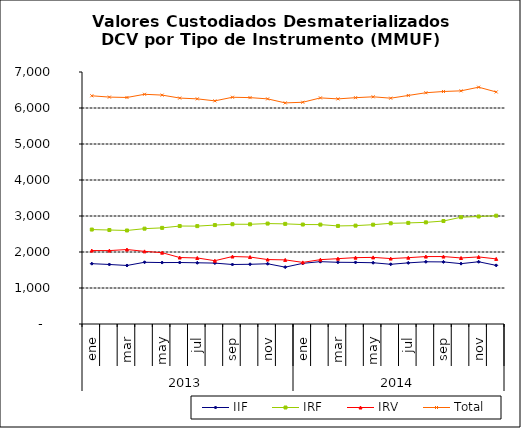
| Category | IIF | IRF | IRV | Total |
|---|---|---|---|---|
| 0 | 1675.661 | 2623.433 | 2040.209 | 6339.304 |
| 1900-01-01 | 1653.38 | 2610.269 | 2039.052 | 6302.701 |
| 1900-01-02 | 1625.654 | 2597.812 | 2068.804 | 6292.27 |
| 1900-01-03 | 1714.816 | 2648.442 | 2017.792 | 6381.05 |
| 1900-01-04 | 1706.556 | 2670.19 | 1981.652 | 6358.399 |
| 1900-01-05 | 1708.057 | 2721.259 | 1846.579 | 6275.895 |
| 1900-01-06 | 1700.223 | 2719.153 | 1834.309 | 6253.685 |
| 1900-01-07 | 1691.581 | 2748.09 | 1758.669 | 6198.341 |
| 1900-01-08 | 1652.698 | 2771.402 | 1874.421 | 6298.52 |
| 1900-01-09 | 1658.715 | 2769.674 | 1859.962 | 6288.351 |
| 1900-01-10 | 1673.399 | 2789.673 | 1790.218 | 6253.29 |
| 1900-01-11 | 1579.011 | 2781.284 | 1781.214 | 6141.51 |
| 1900-01-12 | 1685.081 | 2762.731 | 1711.633 | 6159.445 |
| 1900-01-13 | 1732.193 | 2760.863 | 1787.756 | 6280.813 |
| 1900-01-14 | 1714.333 | 2724.253 | 1814.882 | 6253.467 |
| 1900-01-15 | 1710.591 | 2732.637 | 1843.591 | 6286.819 |
| 1900-01-16 | 1701.759 | 2758.911 | 1850.323 | 6310.993 |
| 1900-01-17 | 1658.659 | 2796.814 | 1817.341 | 6272.814 |
| 1900-01-18 | 1697.963 | 2808.252 | 1842.196 | 6348.411 |
| 1900-01-19 | 1727.945 | 2823.108 | 1872.893 | 6423.945 |
| 1900-01-20 | 1724.487 | 2860.277 | 1873.636 | 6458.4 |
| 1900-01-21 | 1676.511 | 2966.03 | 1834.205 | 6476.745 |
| 1900-01-22 | 1728.497 | 2986.128 | 1863.237 | 6577.862 |
| 1900-01-23 | 1628.306 | 3008.797 | 1808.275 | 6445.378 |